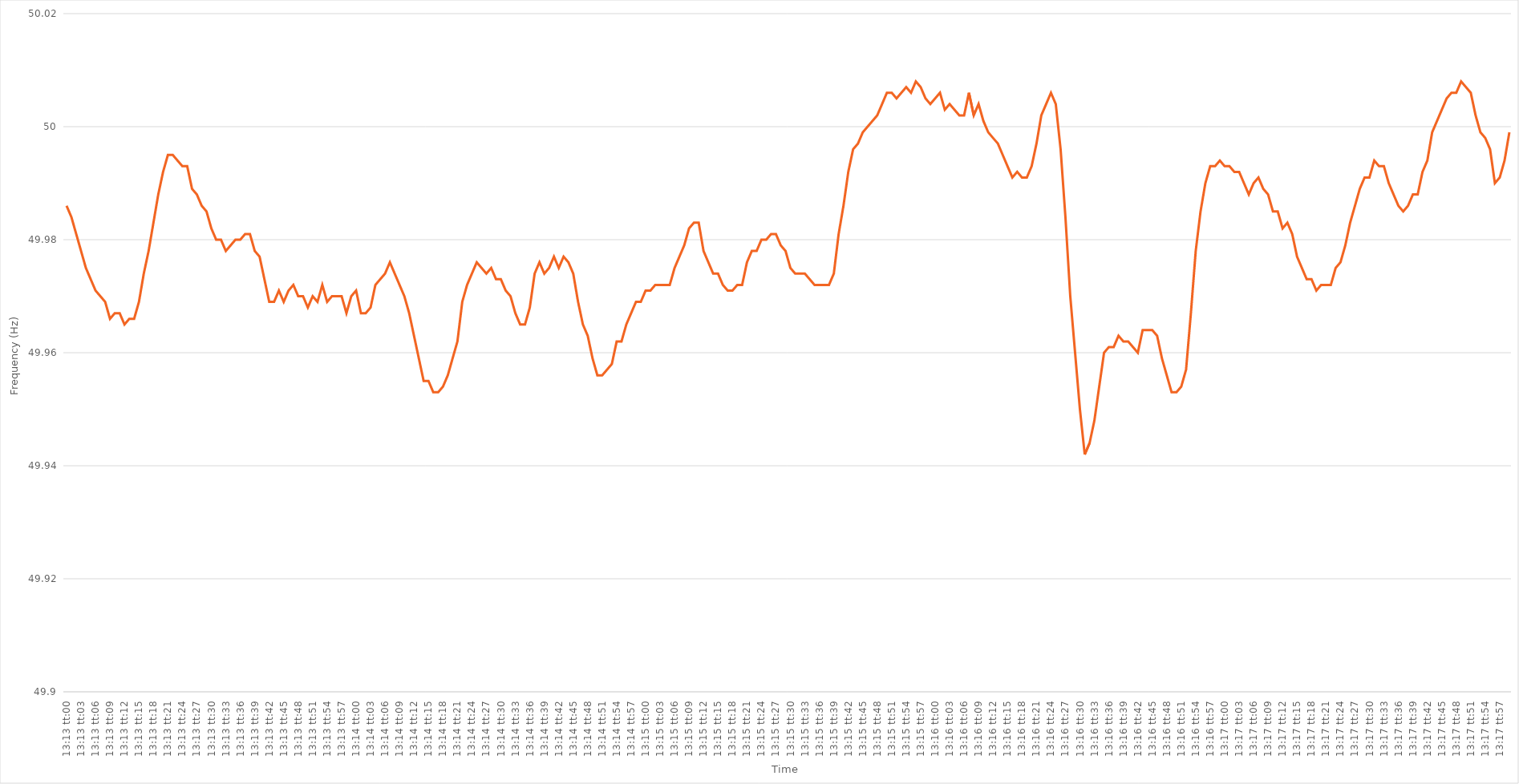
| Category | Series 0 |
|---|---|
| 0.5506944444444445 | 49.986 |
| 0.5507060185185185 | 49.984 |
| 0.5507175925925926 | 49.981 |
| 0.5507291666666666 | 49.978 |
| 0.5507407407407408 | 49.975 |
| 0.5507523148148148 | 49.973 |
| 0.5507638888888889 | 49.971 |
| 0.550775462962963 | 49.97 |
| 0.550787037037037 | 49.969 |
| 0.5507986111111111 | 49.966 |
| 0.5508101851851852 | 49.967 |
| 0.5508217592592592 | 49.967 |
| 0.5508333333333334 | 49.965 |
| 0.5508449074074074 | 49.966 |
| 0.5508564814814815 | 49.966 |
| 0.5508680555555555 | 49.969 |
| 0.5508796296296297 | 49.974 |
| 0.5508912037037037 | 49.978 |
| 0.5509027777777779 | 49.983 |
| 0.5509143518518519 | 49.988 |
| 0.5509259259259259 | 49.992 |
| 0.5509375 | 49.995 |
| 0.550949074074074 | 49.995 |
| 0.5509606481481482 | 49.994 |
| 0.5509722222222222 | 49.993 |
| 0.5509837962962963 | 49.993 |
| 0.5509953703703704 | 49.989 |
| 0.5510069444444444 | 49.988 |
| 0.5510185185185185 | 49.986 |
| 0.5510300925925926 | 49.985 |
| 0.5510416666666667 | 49.982 |
| 0.5510532407407408 | 49.98 |
| 0.5510648148148148 | 49.98 |
| 0.5510763888888889 | 49.978 |
| 0.5510879629629629 | 49.979 |
| 0.5510995370370371 | 49.98 |
| 0.5511111111111111 | 49.98 |
| 0.5511226851851853 | 49.981 |
| 0.5511342592592593 | 49.981 |
| 0.5511458333333333 | 49.978 |
| 0.5511574074074074 | 49.977 |
| 0.5511689814814814 | 49.973 |
| 0.5511805555555556 | 49.969 |
| 0.5511921296296296 | 49.969 |
| 0.5512037037037038 | 49.971 |
| 0.5512152777777778 | 49.969 |
| 0.5512268518518518 | 49.971 |
| 0.5512384259259259 | 49.972 |
| 0.55125 | 49.97 |
| 0.5512615740740741 | 49.97 |
| 0.5512731481481482 | 49.968 |
| 0.5512847222222222 | 49.97 |
| 0.5512962962962963 | 49.969 |
| 0.5513078703703703 | 49.972 |
| 0.5513194444444445 | 49.969 |
| 0.5513310185185185 | 49.97 |
| 0.5513425925925927 | 49.97 |
| 0.5513541666666667 | 49.97 |
| 0.5513657407407407 | 49.967 |
| 0.5513773148148148 | 49.97 |
| 0.5513888888888888 | 49.971 |
| 0.551400462962963 | 49.967 |
| 0.551412037037037 | 49.967 |
| 0.5514236111111112 | 49.968 |
| 0.5514351851851852 | 49.972 |
| 0.5514467592592592 | 49.973 |
| 0.5514583333333333 | 49.974 |
| 0.5514699074074074 | 49.976 |
| 0.5514814814814815 | 49.974 |
| 0.5514930555555556 | 49.972 |
| 0.5515046296296297 | 49.97 |
| 0.5515162037037037 | 49.967 |
| 0.5515277777777777 | 49.963 |
| 0.5515393518518519 | 49.959 |
| 0.5515509259259259 | 49.955 |
| 0.5515625000000001 | 49.955 |
| 0.5515740740740741 | 49.953 |
| 0.5515856481481481 | 49.953 |
| 0.5515972222222222 | 49.954 |
| 0.5516087962962963 | 49.956 |
| 0.5516203703703704 | 49.959 |
| 0.5516319444444444 | 49.962 |
| 0.5516435185185186 | 49.969 |
| 0.5516550925925926 | 49.972 |
| 0.5516666666666666 | 49.974 |
| 0.5516782407407407 | 49.976 |
| 0.5516898148148148 | 49.975 |
| 0.5517013888888889 | 49.974 |
| 0.551712962962963 | 49.975 |
| 0.551724537037037 | 49.973 |
| 0.5517361111111111 | 49.973 |
| 0.5517476851851851 | 49.971 |
| 0.5517592592592593 | 49.97 |
| 0.5517708333333333 | 49.967 |
| 0.5517824074074075 | 49.965 |
| 0.5517939814814815 | 49.965 |
| 0.5518055555555555 | 49.968 |
| 0.5518171296296296 | 49.974 |
| 0.5518287037037037 | 49.976 |
| 0.5518402777777778 | 49.974 |
| 0.5518518518518518 | 49.975 |
| 0.551863425925926 | 49.977 |
| 0.551875 | 49.975 |
| 0.551886574074074 | 49.977 |
| 0.5518981481481481 | 49.976 |
| 0.5519097222222222 | 49.974 |
| 0.5519212962962963 | 49.969 |
| 0.5519328703703704 | 49.965 |
| 0.5519444444444445 | 49.963 |
| 0.5519560185185185 | 49.959 |
| 0.5519675925925925 | 49.956 |
| 0.5519791666666667 | 49.956 |
| 0.5519907407407407 | 49.957 |
| 0.5520023148148149 | 49.958 |
| 0.5520138888888889 | 49.962 |
| 0.552025462962963 | 49.962 |
| 0.552037037037037 | 49.965 |
| 0.5520486111111111 | 49.967 |
| 0.5520601851851852 | 49.969 |
| 0.5520717592592593 | 49.969 |
| 0.5520833333333334 | 49.971 |
| 0.5520949074074074 | 49.971 |
| 0.5521064814814814 | 49.972 |
| 0.5521180555555555 | 49.972 |
| 0.5521296296296296 | 49.972 |
| 0.5521412037037037 | 49.972 |
| 0.5521527777777778 | 49.975 |
| 0.5521643518518519 | 49.977 |
| 0.5521759259259259 | 49.979 |
| 0.5521874999999999 | 49.982 |
| 0.5521990740740741 | 49.983 |
| 0.5522106481481481 | 49.983 |
| 0.5522222222222223 | 49.978 |
| 0.5522337962962963 | 49.976 |
| 0.5522453703703704 | 49.974 |
| 0.5522569444444444 | 49.974 |
| 0.5522685185185185 | 49.972 |
| 0.5522800925925926 | 49.971 |
| 0.5522916666666667 | 49.971 |
| 0.5523032407407408 | 49.972 |
| 0.5523148148148148 | 49.972 |
| 0.5523263888888889 | 49.976 |
| 0.5523379629629629 | 49.978 |
| 0.552349537037037 | 49.978 |
| 0.5523611111111111 | 49.98 |
| 0.5523726851851852 | 49.98 |
| 0.5523842592592593 | 49.981 |
| 0.5523958333333333 | 49.981 |
| 0.5524074074074073 | 49.979 |
| 0.5524189814814815 | 49.978 |
| 0.5524305555555555 | 49.975 |
| 0.5524421296296297 | 49.974 |
| 0.5524537037037037 | 49.974 |
| 0.5524652777777778 | 49.974 |
| 0.5524768518518518 | 49.973 |
| 0.552488425925926 | 49.972 |
| 0.5525 | 49.972 |
| 0.5525115740740741 | 49.972 |
| 0.5525231481481482 | 49.972 |
| 0.5525347222222222 | 49.974 |
| 0.5525462962962963 | 49.981 |
| 0.5525578703703703 | 49.986 |
| 0.5525694444444444 | 49.992 |
| 0.5525810185185185 | 49.996 |
| 0.5525925925925926 | 49.997 |
| 0.5526041666666667 | 49.999 |
| 0.5526157407407407 | 50 |
| 0.5526273148148148 | 50.001 |
| 0.5526388888888889 | 50.002 |
| 0.5526504629629629 | 50.004 |
| 0.5526620370370371 | 50.006 |
| 0.5526736111111111 | 50.006 |
| 0.5526851851851852 | 50.005 |
| 0.5526967592592592 | 50.006 |
| 0.5527083333333334 | 50.007 |
| 0.5527199074074074 | 50.006 |
| 0.5527314814814815 | 50.008 |
| 0.5527430555555556 | 50.007 |
| 0.5527546296296296 | 50.005 |
| 0.5527662037037037 | 50.004 |
| 0.5527777777777778 | 50.005 |
| 0.5527893518518519 | 50.006 |
| 0.552800925925926 | 50.003 |
| 0.5528125 | 50.004 |
| 0.5528240740740741 | 50.003 |
| 0.5528356481481481 | 50.002 |
| 0.5528472222222222 | 50.002 |
| 0.5528587962962963 | 50.006 |
| 0.5528703703703703 | 50.002 |
| 0.5528819444444445 | 50.004 |
| 0.5528935185185185 | 50.001 |
| 0.5529050925925926 | 49.999 |
| 0.5529166666666666 | 49.998 |
| 0.5529282407407408 | 49.997 |
| 0.5529398148148148 | 49.995 |
| 0.552951388888889 | 49.993 |
| 0.552962962962963 | 49.991 |
| 0.552974537037037 | 49.992 |
| 0.5529861111111111 | 49.991 |
| 0.5529976851851852 | 49.991 |
| 0.5530092592592593 | 49.993 |
| 0.5530208333333334 | 49.997 |
| 0.5530324074074074 | 50.002 |
| 0.5530439814814815 | 50.004 |
| 0.5530555555555555 | 50.006 |
| 0.5530671296296296 | 50.004 |
| 0.5530787037037037 | 49.996 |
| 0.5530902777777778 | 49.984 |
| 0.5531018518518519 | 49.97 |
| 0.5531134259259259 | 49.96 |
| 0.553125 | 49.95 |
| 0.553136574074074 | 49.942 |
| 0.5531481481481482 | 49.944 |
| 0.5531597222222222 | 49.948 |
| 0.5531712962962964 | 49.954 |
| 0.5531828703703704 | 49.96 |
| 0.5531944444444444 | 49.961 |
| 0.5532060185185185 | 49.961 |
| 0.5532175925925926 | 49.963 |
| 0.5532291666666667 | 49.962 |
| 0.5532407407407408 | 49.962 |
| 0.5532523148148148 | 49.961 |
| 0.5532638888888889 | 49.96 |
| 0.5532754629629629 | 49.964 |
| 0.553287037037037 | 49.964 |
| 0.5532986111111111 | 49.964 |
| 0.5533101851851852 | 49.963 |
| 0.5533217592592593 | 49.959 |
| 0.5533333333333333 | 49.956 |
| 0.5533449074074074 | 49.953 |
| 0.5533564814814814 | 49.953 |
| 0.5533680555555556 | 49.954 |
| 0.5533796296296296 | 49.957 |
| 0.5533912037037038 | 49.967 |
| 0.5534027777777778 | 49.978 |
| 0.5534143518518518 | 49.985 |
| 0.5534259259259259 | 49.99 |
| 0.5534375 | 49.993 |
| 0.5534490740740741 | 49.993 |
| 0.5534606481481482 | 49.994 |
| 0.5534722222222223 | 49.993 |
| 0.5534837962962963 | 49.993 |
| 0.5534953703703703 | 49.992 |
| 0.5535069444444445 | 49.992 |
| 0.5535185185185185 | 49.99 |
| 0.5535300925925926 | 49.988 |
| 0.5535416666666667 | 49.99 |
| 0.5535532407407407 | 49.991 |
| 0.5535648148148148 | 49.989 |
| 0.5535763888888888 | 49.988 |
| 0.553587962962963 | 49.985 |
| 0.553599537037037 | 49.985 |
| 0.5536111111111112 | 49.982 |
| 0.5536226851851852 | 49.983 |
| 0.5536342592592592 | 49.981 |
| 0.5536458333333333 | 49.977 |
| 0.5536574074074074 | 49.975 |
| 0.5536689814814815 | 49.973 |
| 0.5536805555555556 | 49.973 |
| 0.5536921296296297 | 49.971 |
| 0.5537037037037037 | 49.972 |
| 0.5537152777777777 | 49.972 |
| 0.5537268518518519 | 49.972 |
| 0.5537384259259259 | 49.975 |
| 0.55375 | 49.976 |
| 0.5537615740740741 | 49.979 |
| 0.5537731481481482 | 49.983 |
| 0.5537847222222222 | 49.986 |
| 0.5537962962962962 | 49.989 |
| 0.5538078703703704 | 49.991 |
| 0.5538194444444444 | 49.991 |
| 0.5538310185185186 | 49.994 |
| 0.5538425925925926 | 49.993 |
| 0.5538541666666666 | 49.993 |
| 0.5538657407407407 | 49.99 |
| 0.5538773148148148 | 49.988 |
| 0.5538888888888889 | 49.986 |
| 0.553900462962963 | 49.985 |
| 0.5539120370370371 | 49.986 |
| 0.5539236111111111 | 49.988 |
| 0.5539351851851851 | 49.988 |
| 0.5539467592592593 | 49.992 |
| 0.5539583333333333 | 49.994 |
| 0.5539699074074074 | 49.999 |
| 0.5539814814814815 | 50.001 |
| 0.5539930555555556 | 50.003 |
| 0.5540046296296296 | 50.005 |
| 0.5540162037037036 | 50.006 |
| 0.5540277777777778 | 50.006 |
| 0.5540393518518518 | 50.008 |
| 0.554050925925926 | 50.007 |
| 0.5540625 | 50.006 |
| 0.554074074074074 | 50.002 |
| 0.5540856481481481 | 49.999 |
| 0.5540972222222222 | 49.998 |
| 0.5541087962962963 | 49.996 |
| 0.5541203703703704 | 49.99 |
| 0.5541319444444445 | 49.991 |
| 0.5541435185185185 | 49.994 |
| 0.5541550925925925 | 49.999 |